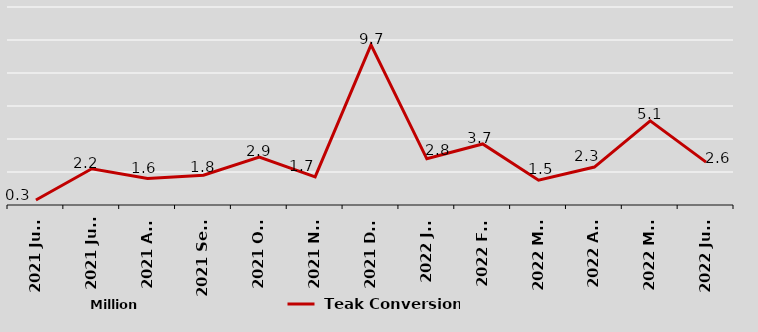
| Category |  Teak Conversion |
|---|---|
| 2021 June | 0.3 |
| 2021 July | 2.2 |
| 2021 Aug | 1.6 |
| 2021 Sept | 1.8 |
| 2021 Oct | 2.9 |
| 2021 Nov | 1.7 |
| 2021 Dec | 9.7 |
| 2022 Jan | 2.8 |
| 2022 Feb | 3.7 |
| 2022 Mar | 1.5 |
| 2022 Apr | 2.3 |
| 2022 May | 5.1 |
| 2022 June | 2.6 |